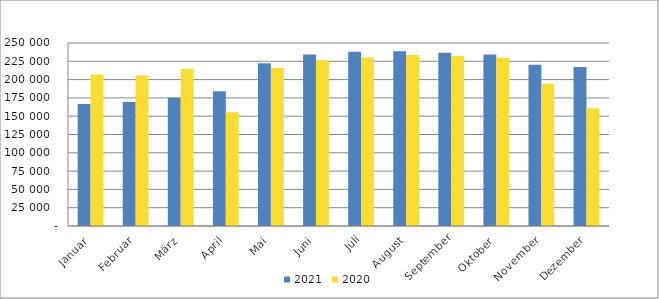
| Category | 2021 | 2020 |
|---|---|---|
| Januar | 166782 | 207053 |
| Februar | 169496 | 205695 |
| März | 175211 | 214768 |
| April | 184189 | 155433 |
| Mai | 222364 | 215701 |
| Juni | 234144 | 226300 |
| Juli | 238061 | 230123 |
| August | 238863 | 233456 |
| September | 236822 | 232266 |
| Oktober | 234389 | 229785 |
| November | 220142 | 194308 |
| Dezember | 217291 | 160807 |